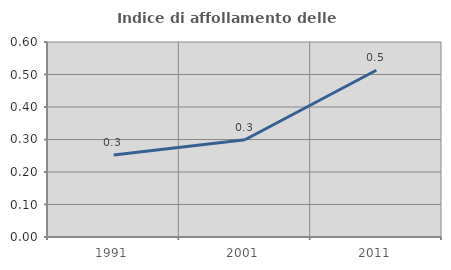
| Category | Indice di affollamento delle abitazioni  |
|---|---|
| 1991.0 | 0.253 |
| 2001.0 | 0.299 |
| 2011.0 | 0.513 |